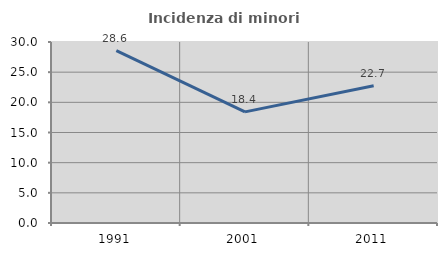
| Category | Incidenza di minori stranieri |
|---|---|
| 1991.0 | 28.571 |
| 2001.0 | 18.421 |
| 2011.0 | 22.749 |